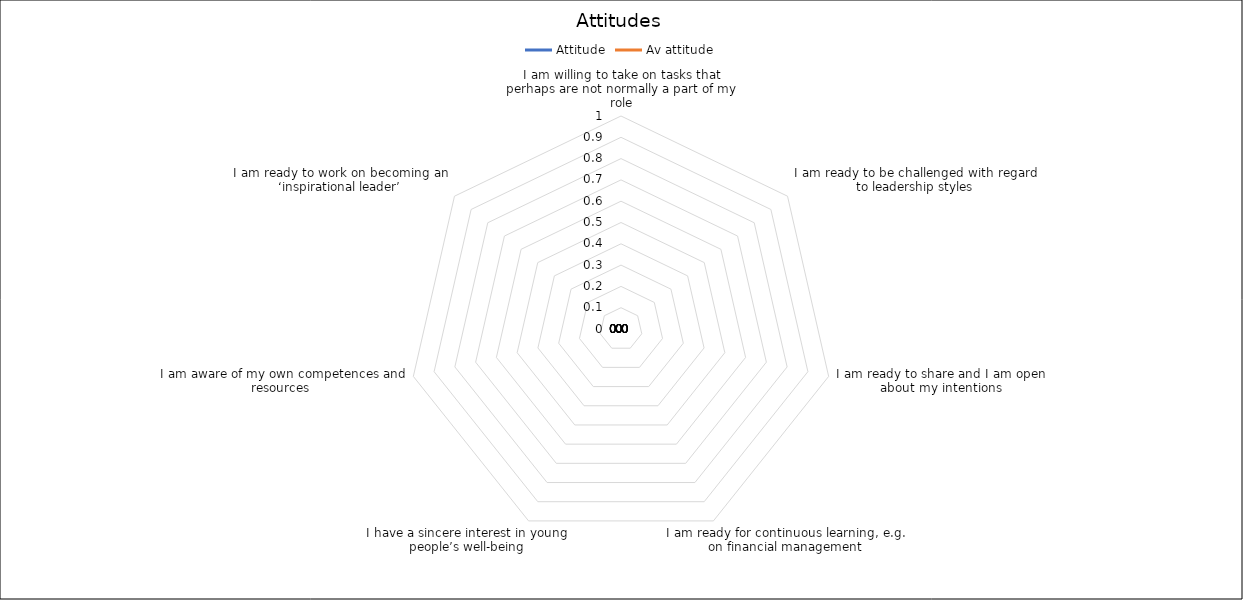
| Category | Attitude | Av attitude |
|---|---|---|
| I am willing to take on tasks that perhaps are not normally a part of my role | 0 | 0 |
| I am ready to be challenged with regard to leadership styles | 0 | 0 |
| I am ready to share and I am open about my intentions | 0 | 0 |
| I am ready for continuous learning, e.g. on financial management | 0 | 0 |
| I have a sincere interest in young people’s well-being | 0 | 0 |
| I am aware of my own competences and resources  | 0 | 0 |
| I am ready to work on becoming an ‘inspirational leader’ | 0 | 0 |